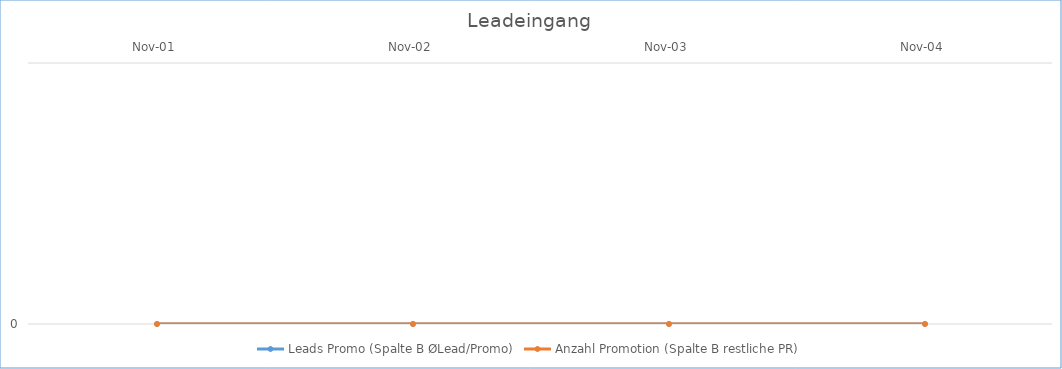
| Category | Leads Promo (Spalte B ØLead/Promo) | Anzahl Promotion (Spalte B restliche PR) |
|---|---|---|
| 2001-11-01 | 0 | 0 |
| 2002-11-01 | 0 | 0 |
| 2003-11-01 | 0 | 0 |
| 2004-11-01 | 0 | 0 |